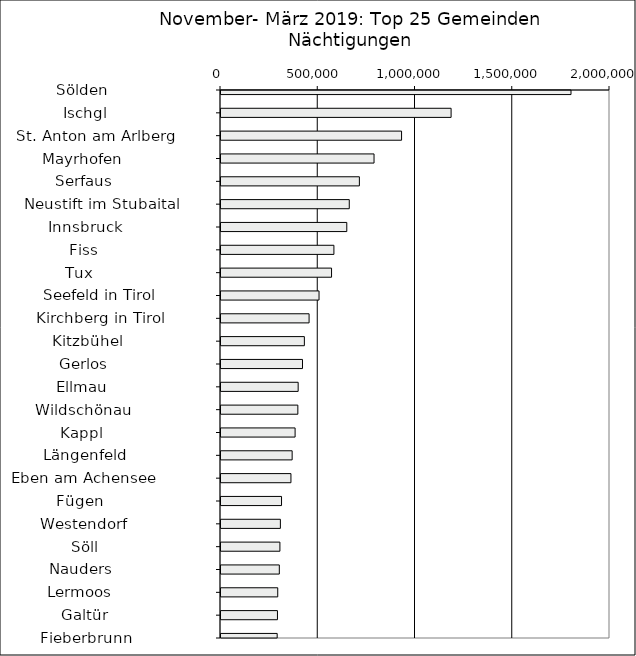
| Category | Series 0 |
|---|---|
|   Sölden                     | 1799501 |
|   Ischgl                     | 1183041 |
|   St. Anton am Arlberg       | 928357 |
|   Mayrhofen                  | 786858 |
|   Serfaus                    | 711513 |
|   Neustift im Stubaital      | 659498 |
|   Innsbruck                  | 646694 |
|   Fiss                       | 580521 |
|   Tux                        | 568372 |
|   Seefeld in Tirol           | 504096 |
|   Kirchberg in Tirol         | 452899 |
|   Kitzbühel                  | 428656 |
|   Gerlos                     | 418961 |
|   Ellmau                     | 396712 |
|   Wildschönau                | 395105 |
|   Kappl                      | 380994 |
|   Längenfeld                 | 365803 |
|   Eben am Achensee           | 359646 |
|   Fügen                      | 311264 |
|   Westendorf                 | 305321 |
|   Söll                       | 302934 |
|   Nauders                    | 299822 |
|   Lermoos                    | 291726 |
|   Galtür                     | 290325 |
|   Fieberbrunn                | 288876 |